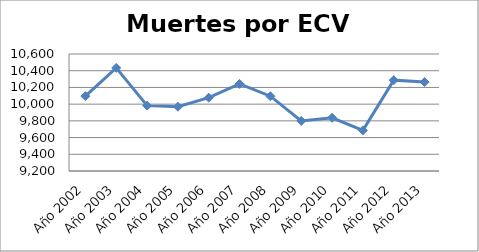
| Category | Series 0 |
|---|---|
| Año 2002 | 10096 |
| Año 2003 | 10434 |
| Año 2004 | 9982 |
| Año 2005 | 9969 |
| Año 2006 | 10077 |
| Año 2007 | 10242 |
| Año 2008 | 10095 |
| Año 2009 | 9799 |
| Año 2010 | 9837 |
| Año 2011 | 9686 |
| Año 2012 | 10287 |
| Año 2013 | 10264 |